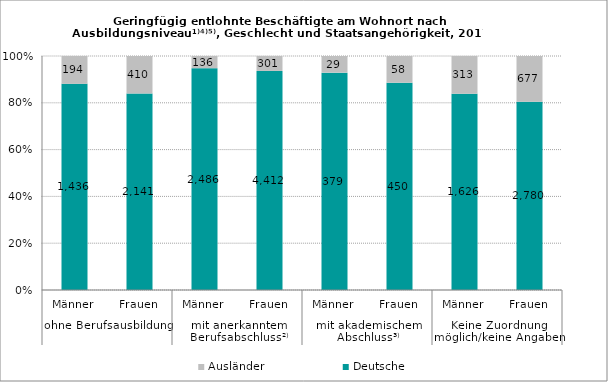
| Category | Deutsche | Ausländer |
|---|---|---|
| 0 | 1436 | 194 |
| 1 | 2141 | 410 |
| 2 | 2486 | 136 |
| 3 | 4412 | 301 |
| 4 | 379 | 29 |
| 5 | 450 | 58 |
| 6 | 1626 | 313 |
| 7 | 2780 | 677 |